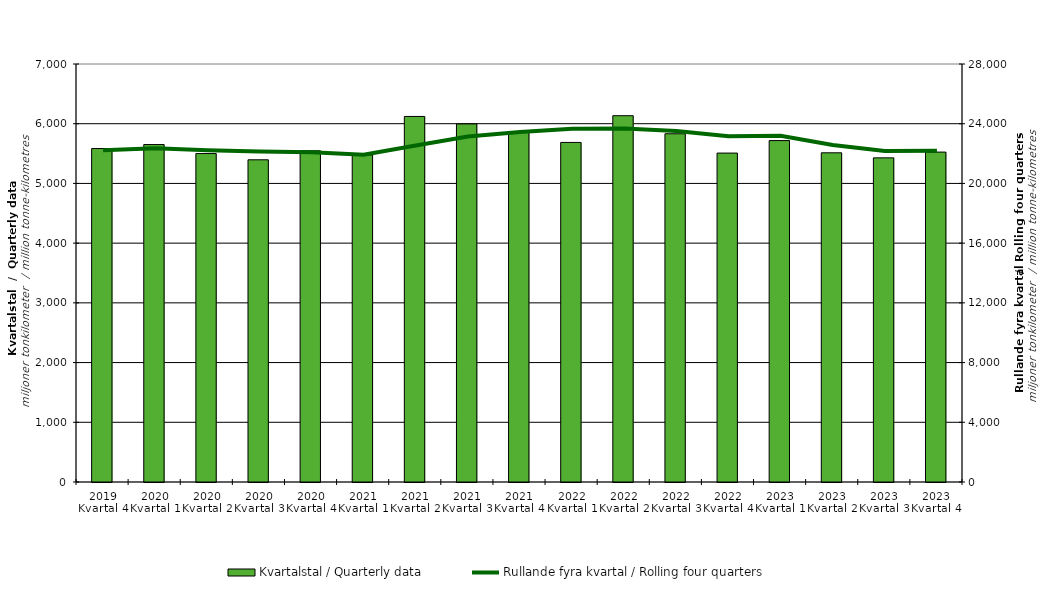
| Category | Kvartalstal / Quarterly data |
|---|---|
| 2019 Kvartal 4 | 5584.286 |
| 2020 Kvartal 1 | 5650.915 |
| 2020 Kvartal 2 | 5500.334 |
| 2020 Kvartal 3 | 5395.987 |
| 2020 Kvartal 4 | 5546.662 |
| 2021 Kvartal 1 | 5476.427 |
| 2021 Kvartal 2 | 6121.807 |
| 2021 Kvartal 3 | 5996.688 |
| 2021 Kvartal 4 | 5853.966 |
| 2022 Kvartal 1 | 5686.696 |
| 2022 Kvartal 2 | 6134.1 |
| 2022 Kvartal 3 | 5831.909 |
| 2022 Kvartal 4 | 5508.231 |
| 2023 Kvartal 1 | 5717.368 |
| 2023 Kvartal 2 | 5512.865 |
| 2023 Kvartal 3 | 5428.06 |
| 2023 Kvartal 4 | 5524.902 |